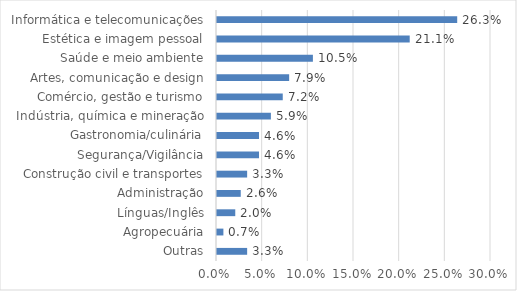
| Category | Series 0 |
|---|---|
| Outras | 0.033 |
| Agropecuária | 0.007 |
| Línguas/Inglês | 0.02 |
| Administração | 0.026 |
| Construção civil e transportes | 0.033 |
| Segurança/Vigilância | 0.046 |
| Gastronomia/culinária | 0.046 |
| Indústria, química e mineração | 0.059 |
| Comércio, gestão e turismo | 0.072 |
| Artes, comunicação e design | 0.079 |
| Saúde e meio ambiente | 0.105 |
| Estética e imagem pessoal | 0.211 |
| Informática e telecomunicações | 0.263 |